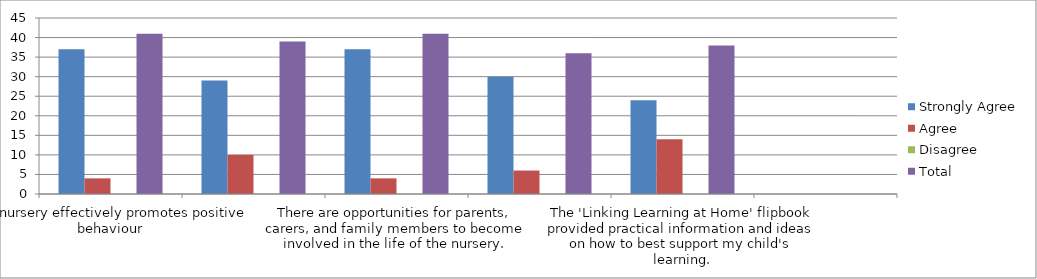
| Category | Strongly Agree | Agree | Disagree | Total |
|---|---|---|---|---|
| The nursery effectively promotes positive behaviour | 37 | 4 | 0 | 41 |
| Staff have high expectations of my child | 29 | 10 | 0 | 39 |
| There are opportunities for parents, carers, and family members to become involved in the life of the nursery. | 37 | 4 | 0 | 41 |
| The nursery curriculum evening provided information on nursery routines & approaches to learning. (if applicable) | 30 | 6 | 0 | 36 |
| The 'Linking Learning at Home' flipbook provided practical information and ideas on how to best support my child's learning. | 24 | 14 | 0 | 38 |